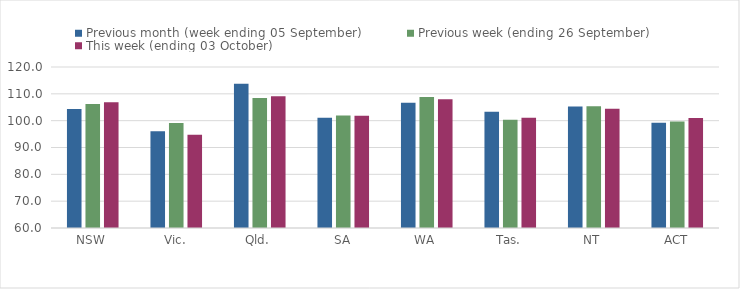
| Category | Previous month (week ending 05 September) | Previous week (ending 26 September) | This week (ending 03 October) |
|---|---|---|---|
| NSW | 104.32 | 106.21 | 106.85 |
| Vic. | 96.08 | 99.15 | 94.76 |
| Qld. | 113.77 | 108.46 | 109.07 |
| SA | 101.08 | 101.89 | 101.87 |
| WA | 106.66 | 108.78 | 108.01 |
| Tas. | 103.3 | 100.37 | 101.1 |
| NT | 105.32 | 105.37 | 104.46 |
| ACT | 99.2 | 99.71 | 100.96 |